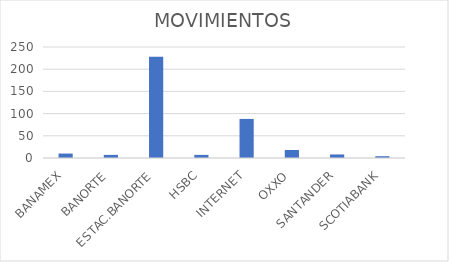
| Category | MOVIMIENTOS |
|---|---|
| BANAMEX | 10 |
| BANORTE | 7 |
| ESTAC.BANORTE | 228 |
| HSBC | 7 |
| INTERNET | 88 |
| OXXO | 18 |
| SANTANDER | 8 |
| SCOTIABANK | 4 |